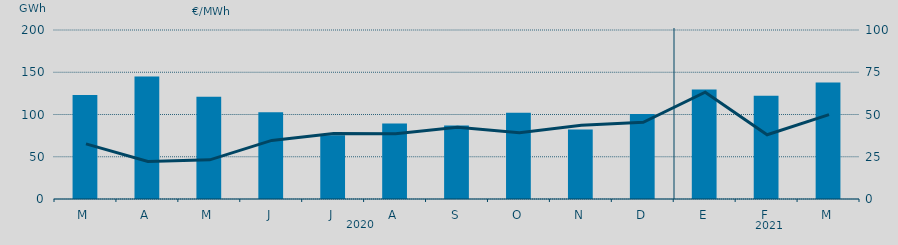
| Category | Energía a subir |
|---|---|
| M | 123.158 |
| A | 144.862 |
| M | 120.894 |
| J | 102.756 |
| J | 75.579 |
| A | 89.481 |
| S | 86.928 |
| O | 102.214 |
| N | 82.319 |
| D | 100.586 |
| E | 129.563 |
| F | 122.251 |
| M | 138.008 |